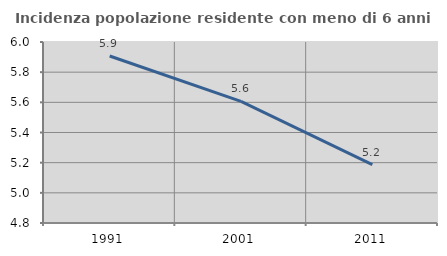
| Category | Incidenza popolazione residente con meno di 6 anni |
|---|---|
| 1991.0 | 5.907 |
| 2001.0 | 5.606 |
| 2011.0 | 5.187 |